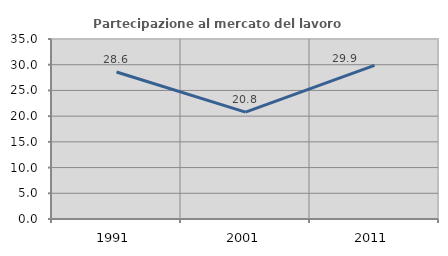
| Category | Partecipazione al mercato del lavoro  femminile |
|---|---|
| 1991.0 | 28.591 |
| 2001.0 | 20.774 |
| 2011.0 | 29.87 |